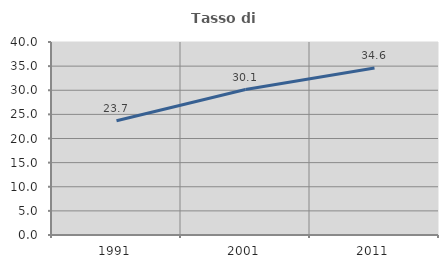
| Category | Tasso di occupazione   |
|---|---|
| 1991.0 | 23.691 |
| 2001.0 | 30.141 |
| 2011.0 | 34.592 |